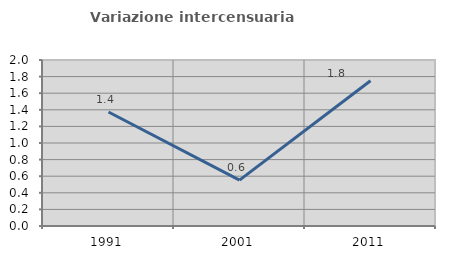
| Category | Variazione intercensuaria annua |
|---|---|
| 1991.0 | 1.374 |
| 2001.0 | 0.552 |
| 2011.0 | 1.75 |